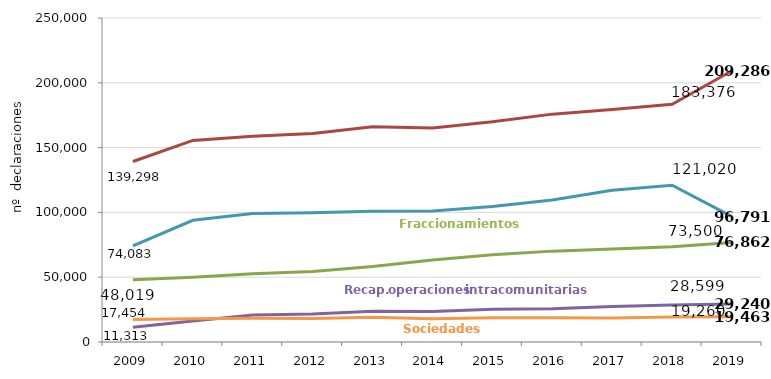
| Category | IVA | Fraccionamientos | Recapitulativa operaciones intracomunitarias | Informativas | Sociedades |
|---|---|---|---|---|---|
| 2009.0 | 139298 | 48019 | 11313 | 74083 | 17454 |
| 2010.0 | 155555 | 49976 | 16241 | 93924 | 17852 |
| 2011.0 | 158799 | 52600 | 20904 | 99132 | 18416 |
| 2012.0 | 160883 | 54438 | 21534 | 99711 | 18042 |
| 2013.0 | 166124 | 58345 | 23760 | 100895 | 19090 |
| 2014.0 | 165166 | 63305 | 23561 | 101111 | 18005 |
| 2015.0 | 169888 | 67411 | 25186 | 104491 | 18631 |
| 2016.0 | 175821 | 70118 | 25707 | 109620 | 18652 |
| 2017.0 | 179378 | 71775 | 27402 | 117016 | 18540 |
| 2018.0 | 183376 | 73500 | 28599 | 121020 | 19260 |
| 2019.0 | 209286 | 76862 | 29240 | 96791 | 19463 |